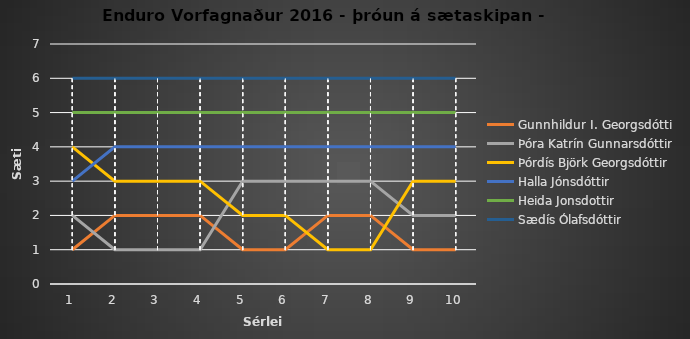
| Category | Gunnhildur I. Georgsdótti | Þóra Katrín Gunnarsdóttir | Þórdís Björk Georgsdóttir | Halla Jónsdóttir | Heida Jonsdottir | Sædís Ólafsdóttir |
|---|---|---|---|---|---|---|
| 0 | 1 | 2 | 4 | 3 | 5 | 6 |
| 1 | 2 | 1 | 3 | 4 | 5 | 6 |
| 2 | 2 | 1 | 3 | 4 | 5 | 6 |
| 3 | 2 | 1 | 3 | 4 | 5 | 6 |
| 4 | 1 | 3 | 2 | 4 | 5 | 6 |
| 5 | 1 | 3 | 2 | 4 | 5 | 6 |
| 6 | 2 | 3 | 1 | 4 | 5 | 6 |
| 7 | 2 | 3 | 1 | 4 | 5 | 6 |
| 8 | 1 | 2 | 3 | 4 | 5 | 6 |
| 9 | 1 | 2 | 3 | 4 | 5 | 6 |